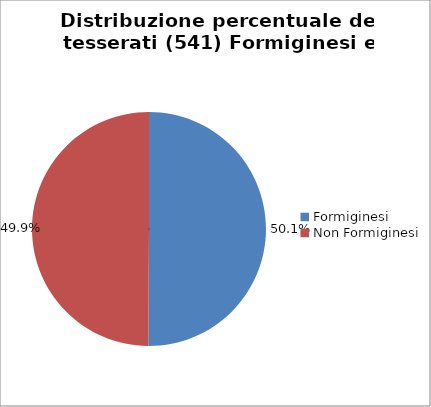
| Category | Nr. Tesserati |
|---|---|
| Formiginesi | 271 |
| Non Formiginesi | 270 |